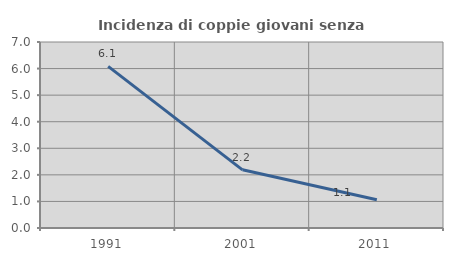
| Category | Incidenza di coppie giovani senza figli |
|---|---|
| 1991.0 | 6.081 |
| 2001.0 | 2.19 |
| 2011.0 | 1.061 |